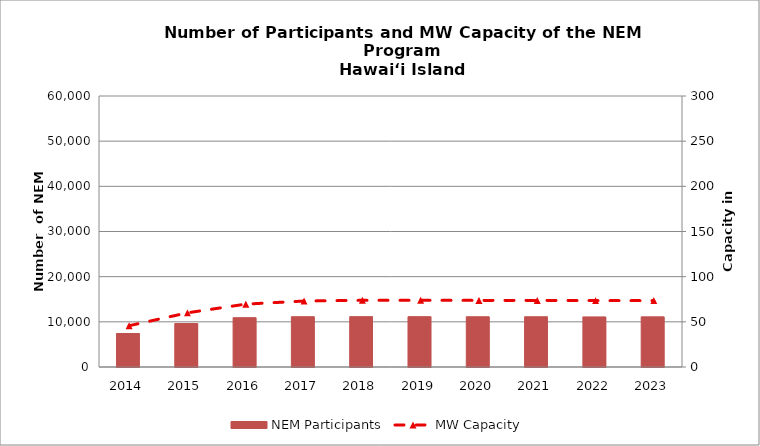
| Category | NEM Participants |
|---|---|
| 2014.0 | 7416 |
| 2015.0 | 9626 |
| 2016.0 | 10924 |
| 2017.0 | 11133 |
| 2018.0 | 11148 |
| 2019.0 | 11146 |
| 2020.0 | 11124 |
| 2021.0 | 11124 |
| 2022.0 | 11093 |
| 2023.0 | 11100 |